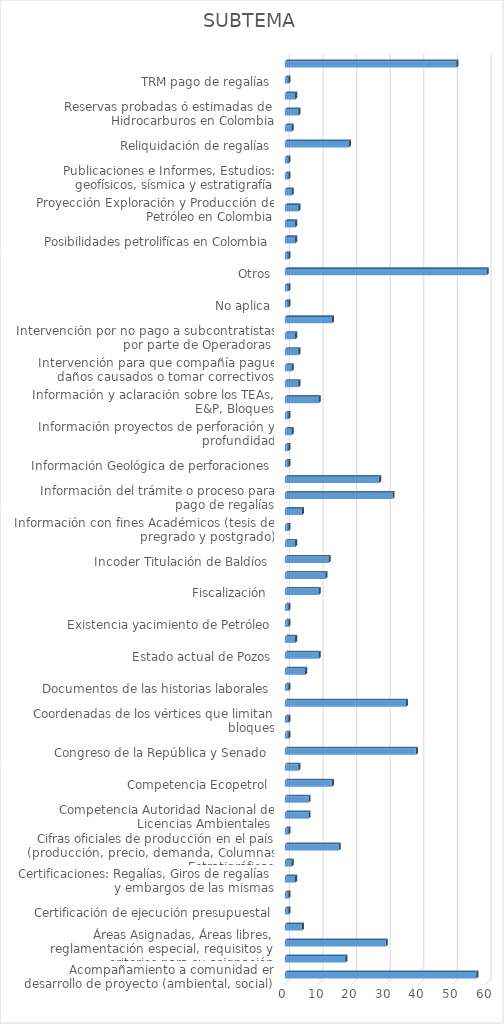
| Category | Series 0 |
|---|---|
| Acompañamiento a comunidad en desarrollo de proyecto (ambiental, social) | 57 |
| Actividad Hidrocarburífera en regiones del país | 18 |
| Áreas Asignadas, Áreas libres, reglamentación especial, requisitos y criterios para su asignación | 30 |
| Cartografía zonas Petrolera | 5 |
| Certificación de ejecución presupuestal | 1 |
| Certificación laboral Colaborador (funcionario o contratista) | 1 |
| Certificaciones: Regalías, Giros de regalías y embargos de las mismas | 3 |
| Certificado estado de pozos | 2 |
| Cifras oficiales de producción en el país (producción, precio, demanda, Columnas Estratigráficas | 16 |
| Competencia Agencia Nacional de Minería  | 1 |
| Competencia Autoridad Nacional de Licencias Ambientales  | 7 |
| Competencia del Ministerio de Minas y Energía  | 7 |
| Competencia Ecopetrol  | 14 |
| Comportamiento del mercado de hidrocarburos en Colombia (producción y consumo interno petróleo y gas) | 4 |
| Congreso de la República y Senado  | 39 |
| Congreso y Senado de la República | 1 |
| Coordenadas de los vértices que limitan bloques | 1 |
| Copias de contratos (E&P, TEAS y Administrativos) | 36 |
| Documentos de las historias laborales | 1 |
| Empresas con pozos en producción o exploración | 6 |
| Estado actual de Pozos | 10 |
| Estudios geofísicos y de sísmica | 3 |
| Existencia yacimiento de Petróleo | 1 |
| Financiera | 1 |
| Fiscalización  | 10 |
| Fracking  | 12 |
| Incoder Titulación de Baldíos  | 13 |
| Inconformidad por desarrollo irregular de proyecto | 3 |
| Información con fines Académicos (tesis de pregrado y postgrado) | 1 |
| Información de Operadores en Colombia | 5 |
| Información del trámite o proceso para pago de regalías | 32 |
| Información en formato shapefile acerca de las reservas naturales, humedales y comunidades | 28 |
| Información Geológica de perforaciones | 1 |
| Información Institucional: Transformación de Ecopetrol en ANH, misión, visión, funciones y objetivos | 1 |
| Información proyectos de perforación y profundidad | 2 |
| Información y aclaración procesos contractuales, términos de referencia, plazos, pólizas | 1 |
| Información y aclaración sobre los TEAs, E&P, Bloques | 10 |
| Informes sobres Consultas previas | 4 |
| Intervención para que compañía pague daños causados o tomar correctivos | 2 |
| Intervención para que operador vincule personal | 4 |
| Intervención por no pago a subcontratistas por parte de Operadoras  | 3 |
| Listas de Elegibles | 14 |
| No aplica | 1 |
| Normatividad sobre exploración, regulación y producción de Hidrocarburos | 1 |
| Otros | 60 |
| Planes de manejo ambiental: Licencias, compromisos E&P, normatividad contaminación | 1 |
| Posibilidades petrolifícas en Colombia | 3 |
| Probable existencia de yacimiento Petrolero | 3 |
| Proyección Exploración y Producción de Petróleo en Colombia | 4 |
| Proyecciones del país en pozos y sísmica | 2 |
| Publicaciones e Informes, Estudios: geofísicos, sísmica y estratigrafía | 1 |
| Recursos de regalías girados por municipio y departamentos | 1 |
| Reliquidación de regalías | 19 |
| Reliquidación de regalías  | 2 |
| Reservas probadas ó estimadas de Hidrocarburos en Colombia | 4 |
| Rondas Colombia | 3 |
| TRM pago de regalías | 1 |
| (en blanco) | 51 |